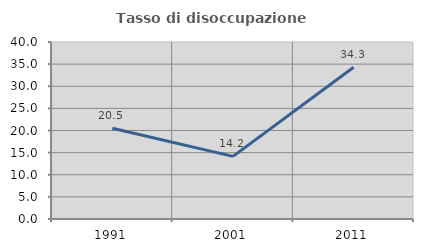
| Category | Tasso di disoccupazione giovanile  |
|---|---|
| 1991.0 | 20.524 |
| 2001.0 | 14.151 |
| 2011.0 | 34.286 |